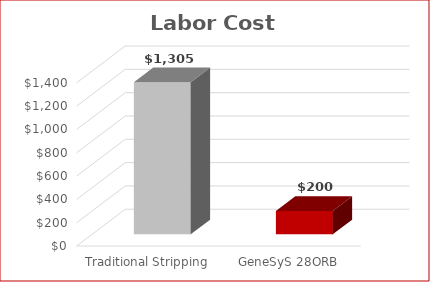
| Category | Labor Cost ($) |
|---|---|
| Traditional Stripping | 1305.45 |
| GeneSyS 28ORB | 200 |